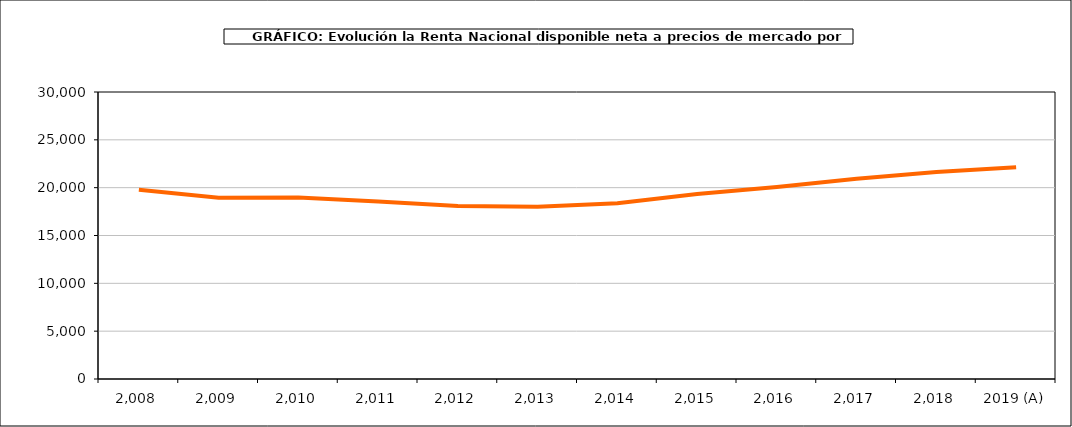
| Category | Renta por habitante |
|---|---|
| 2,008 | 19777.679 |
| 2,009 | 18940.088 |
| 2,010 | 18962.545 |
| 2,011 | 18556.102 |
| 2,012 | 18089.488 |
| 2,013 | 17996.137 |
| 2,014 | 18366.527 |
| 2,015 | 19348.309 |
| 2,016 | 20067.75 |
| 2,017 | 20933.66 |
| 2,018 | 21630.979 |
| 2019 (A) | 22127.972 |